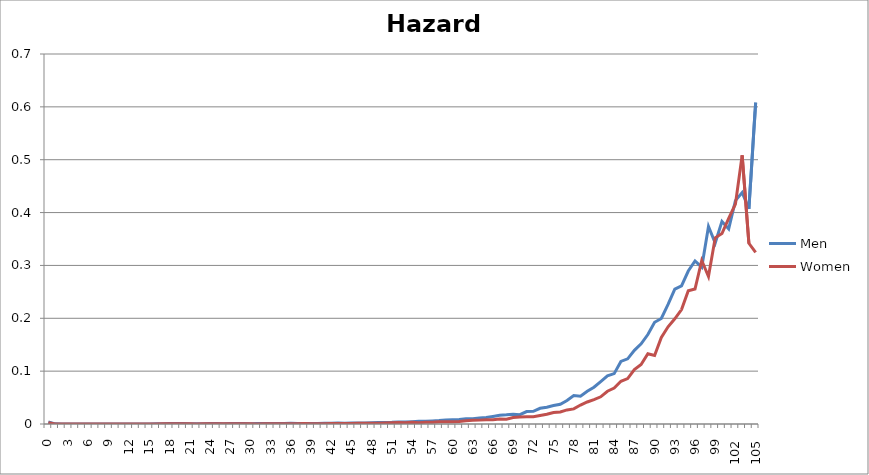
| Category | Men | Women |
|---|---|---|
| 0.0 | 0.004 | 0.002 |
| 1.0 | 0 | 0 |
| 2.0 | 0 | 0 |
| 3.0 | 0 | 0 |
| 4.0 | 0 | 0 |
| 5.0 | 0 | 0 |
| 6.0 | 0 | 0 |
| 7.0 | 0 | 0 |
| 8.0 | 0 | 0 |
| 9.0 | 0 | 0 |
| 10.0 | 0 | 0 |
| 11.0 | 0 | 0 |
| 12.0 | 0 | 0 |
| 13.0 | 0 | 0 |
| 14.0 | 0 | 0 |
| 15.0 | 0 | 0 |
| 16.0 | 0 | 0 |
| 17.0 | 0.001 | 0 |
| 18.0 | 0.001 | 0 |
| 19.0 | 0.001 | 0 |
| 20.0 | 0.001 | 0 |
| 21.0 | 0.001 | 0 |
| 22.0 | 0.001 | 0 |
| 23.0 | 0 | 0 |
| 24.0 | 0.001 | 0 |
| 25.0 | 0.001 | 0 |
| 26.0 | 0.001 | 0 |
| 27.0 | 0.001 | 0 |
| 28.0 | 0.001 | 0 |
| 29.0 | 0.001 | 0 |
| 30.0 | 0.001 | 0 |
| 31.0 | 0.001 | 0 |
| 32.0 | 0.001 | 0.001 |
| 33.0 | 0.001 | 0 |
| 34.0 | 0.001 | 0 |
| 35.0 | 0.001 | 0.001 |
| 36.0 | 0.001 | 0 |
| 37.0 | 0.001 | 0 |
| 38.0 | 0.001 | 0.001 |
| 39.0 | 0.001 | 0.001 |
| 40.0 | 0.001 | 0.001 |
| 41.0 | 0.002 | 0.001 |
| 42.0 | 0.002 | 0.001 |
| 43.0 | 0.002 | 0.001 |
| 44.0 | 0.001 | 0.001 |
| 45.0 | 0.002 | 0.001 |
| 46.0 | 0.002 | 0.002 |
| 47.0 | 0.002 | 0.001 |
| 48.0 | 0.003 | 0.002 |
| 49.0 | 0.003 | 0.002 |
| 50.0 | 0.003 | 0.002 |
| 51.0 | 0.003 | 0.002 |
| 52.0 | 0.004 | 0.003 |
| 53.0 | 0.004 | 0.003 |
| 54.0 | 0.004 | 0.003 |
| 55.0 | 0.005 | 0.003 |
| 56.0 | 0.005 | 0.003 |
| 57.0 | 0.006 | 0.003 |
| 58.0 | 0.006 | 0.004 |
| 59.0 | 0.007 | 0.004 |
| 60.0 | 0.008 | 0.004 |
| 61.0 | 0.008 | 0.005 |
| 62.0 | 0.01 | 0.006 |
| 63.0 | 0.01 | 0.007 |
| 64.0 | 0.011 | 0.007 |
| 65.0 | 0.012 | 0.008 |
| 66.0 | 0.014 | 0.008 |
| 67.0 | 0.016 | 0.009 |
| 68.0 | 0.017 | 0.009 |
| 69.0 | 0.019 | 0.012 |
| 70.0 | 0.018 | 0.013 |
| 71.0 | 0.024 | 0.014 |
| 72.0 | 0.024 | 0.014 |
| 73.0 | 0.03 | 0.016 |
| 74.0 | 0.032 | 0.018 |
| 75.0 | 0.035 | 0.022 |
| 76.0 | 0.037 | 0.023 |
| 77.0 | 0.044 | 0.027 |
| 78.0 | 0.054 | 0.029 |
| 79.0 | 0.053 | 0.036 |
| 80.0 | 0.062 | 0.042 |
| 81.0 | 0.07 | 0.046 |
| 82.0 | 0.08 | 0.051 |
| 83.0 | 0.091 | 0.062 |
| 84.0 | 0.095 | 0.068 |
| 85.0 | 0.118 | 0.081 |
| 86.0 | 0.123 | 0.086 |
| 87.0 | 0.139 | 0.103 |
| 88.0 | 0.152 | 0.113 |
| 89.0 | 0.169 | 0.133 |
| 90.0 | 0.192 | 0.13 |
| 91.0 | 0.2 | 0.164 |
| 92.0 | 0.226 | 0.184 |
| 93.0 | 0.255 | 0.199 |
| 94.0 | 0.261 | 0.216 |
| 95.0 | 0.289 | 0.252 |
| 96.0 | 0.308 | 0.255 |
| 97.0 | 0.297 | 0.309 |
| 98.0 | 0.374 | 0.279 |
| 99.0 | 0.342 | 0.352 |
| 100.0 | 0.383 | 0.36 |
| 101.0 | 0.369 | 0.389 |
| 102.0 | 0.423 | 0.416 |
| 103.0 | 0.438 | 0.508 |
| 104.0 | 0.407 | 0.342 |
| 105.0 | 0.608 | 0.325 |